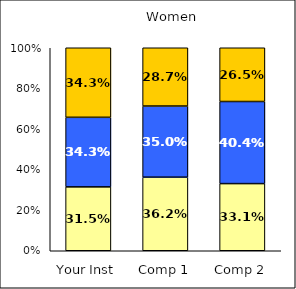
| Category | Low Academic Self-Concept | Average Academic Self-Concept | High Academic Self-Concept |
|---|---|---|---|
| Your Inst | 0.315 | 0.343 | 0.343 |
| Comp 1 | 0.362 | 0.35 | 0.287 |
| Comp 2 | 0.331 | 0.404 | 0.265 |